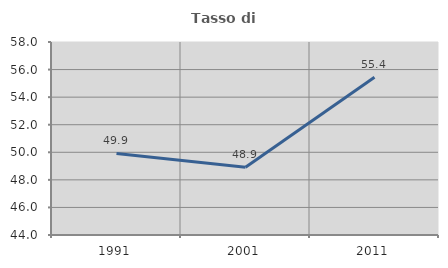
| Category | Tasso di occupazione   |
|---|---|
| 1991.0 | 49.917 |
| 2001.0 | 48.912 |
| 2011.0 | 55.44 |